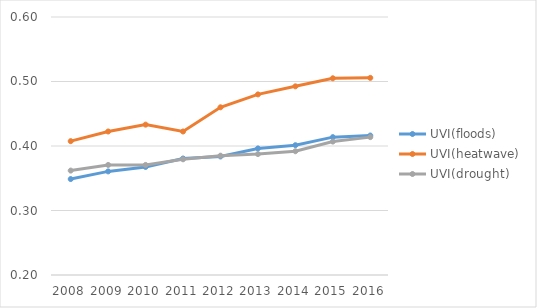
| Category | UVI(floods) | UVI(heatwave) | UVI(drought) |
|---|---|---|---|
| 2008.0 | 0.349 | 0.408 | 0.362 |
| 2009.0 | 0.361 | 0.423 | 0.371 |
| 2010.0 | 0.367 | 0.433 | 0.371 |
| 2011.0 | 0.381 | 0.422 | 0.379 |
| 2012.0 | 0.384 | 0.46 | 0.385 |
| 2013.0 | 0.396 | 0.48 | 0.387 |
| 2014.0 | 0.401 | 0.493 | 0.392 |
| 2015.0 | 0.414 | 0.505 | 0.407 |
| 2016.0 | 0.416 | 0.506 | 0.414 |